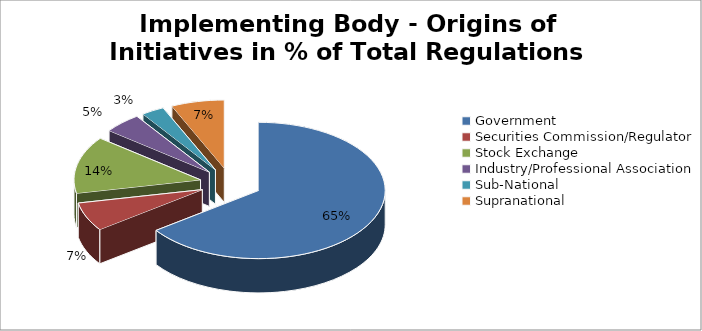
| Category | Total |
|---|---|
| Government  | 67 |
| Securities Commission/Regulator  | 7 |
| Stock Exchange  | 14 |
| Industry/Professional Association  | 5 |
| Sub-National  | 3 |
| Supranational  | 7 |